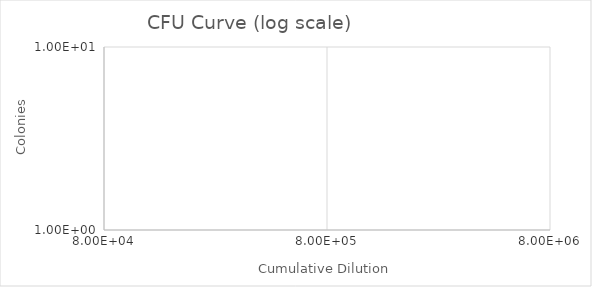
| Category | Series 1 |
|---|---|
| 80000.0 | 0 |
| 800000.0 | 0 |
| 8000000.0 | 0 |